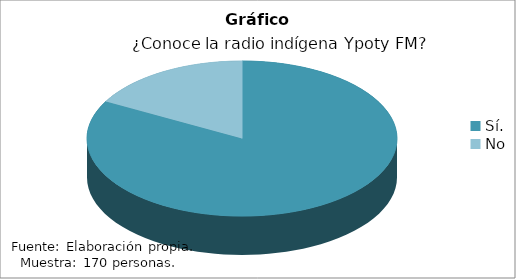
| Category | Series 0 |
|---|---|
| Sí. | 141 |
| No | 29 |